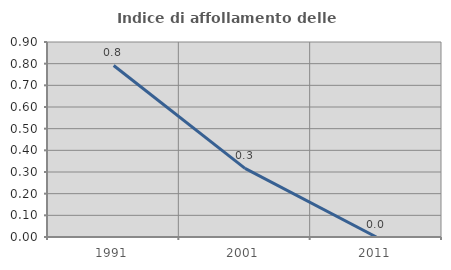
| Category | Indice di affollamento delle abitazioni  |
|---|---|
| 1991.0 | 0.792 |
| 2001.0 | 0.316 |
| 2011.0 | 0 |